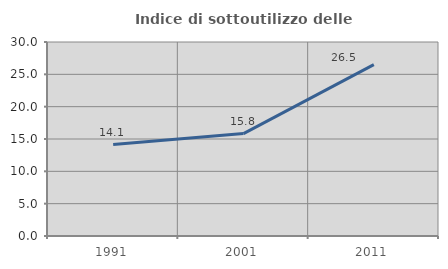
| Category | Indice di sottoutilizzo delle abitazioni  |
|---|---|
| 1991.0 | 14.147 |
| 2001.0 | 15.84 |
| 2011.0 | 26.505 |